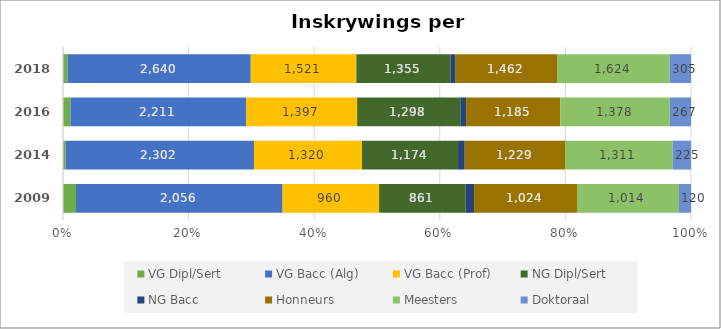
| Category | VG Dipl/Sert | VG Bacc (Alg) | VG Bacc (Prof) | NG Dipl/Sert | NG Bacc | Honneurs | Meesters | Doktoraal | Geleentheids |
|---|---|---|---|---|---|---|---|---|---|
| 2009 | 129 | 2056 | 960 | 861 | 84 | 1024 | 1014 | 120 | 0 |
| 2014 | 32 | 2302 | 1320 | 1174 | 82 | 1229 | 1311 | 225 | 0 |
| 2016 | 94 | 2211 | 1397 | 1298 | 73 | 1185 | 1378 | 267 | 0 |
| 2018 | 65 | 2640 | 1521 | 1355 | 75 | 1462 | 1624 | 305 | 0 |